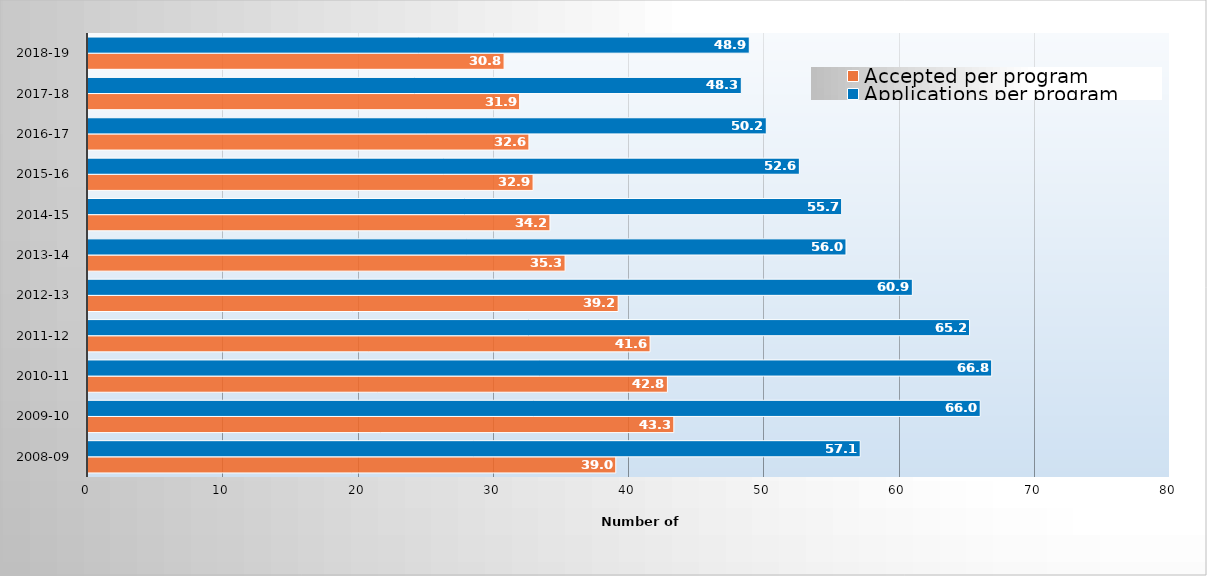
| Category | Accepted per program | Applications per program |
|---|---|---|
| 2008-09 | 39.022 | 57.096 |
| 2009-10 | 43.314 | 65.968 |
| 2010-11 | 42.839 | 66.817 |
| 2011-12 | 41.557 | 65.181 |
| 2012-13 | 39.198 | 60.95 |
| 2013-14 | 35.275 | 56.044 |
| 2014-15 | 34.154 | 55.724 |
| 2015-16 | 32.909 | 52.597 |
| 2016-17 | 32.599 | 50.152 |
| 2017-18 | 31.913 | 48.304 |
| 2018-19 | 30.764 | 48.894 |